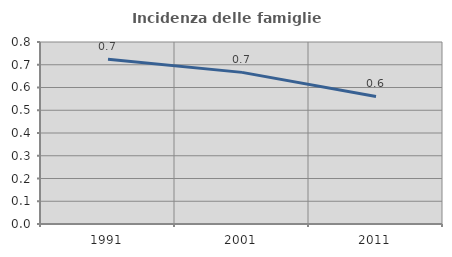
| Category | Incidenza delle famiglie numerose |
|---|---|
| 1991.0 | 0.724 |
| 2001.0 | 0.666 |
| 2011.0 | 0.561 |